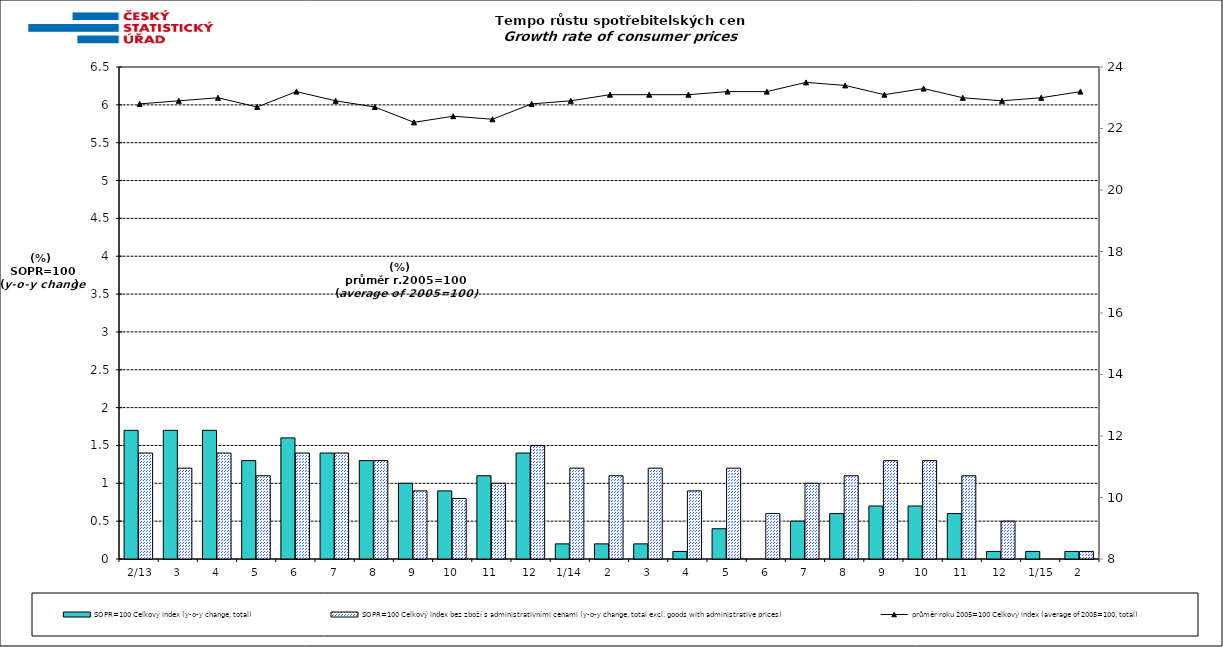
| Category | SOPR=100 Celkový index (y-o-y change, total) | SOPR=100 Celkový index bez zboží s administrativními cenami (y-o-y change, total excl. goods with administrative prices)  |
|---|---|---|
|  2/13 | 1.7 | 1.4 |
| 3 | 1.7 | 1.2 |
| 4 | 1.7 | 1.4 |
| 5 | 1.3 | 1.1 |
| 6 | 1.6 | 1.4 |
| 7 | 1.4 | 1.4 |
| 8 | 1.3 | 1.3 |
| 9 | 1 | 0.9 |
| 10 | 0.9 | 0.8 |
| 11 | 1.1 | 1 |
| 12 | 1.4 | 1.5 |
| 1/14 | 0.2 | 1.2 |
| 2 | 0.2 | 1.1 |
| 3 | 0.2 | 1.2 |
| 4 | 0.1 | 0.9 |
| 5 | 0.4 | 1.2 |
| 6 | 0 | 0.6 |
| 7 | 0.5 | 1 |
| 8 | 0.6 | 1.1 |
| 9 | 0.7 | 1.3 |
| 10 | 0.7 | 1.3 |
| 11 | 0.6 | 1.1 |
| 12 | 0.1 | 0.5 |
|  1/15 | 0.1 | 0 |
| 2 | 0.1 | 0.1 |